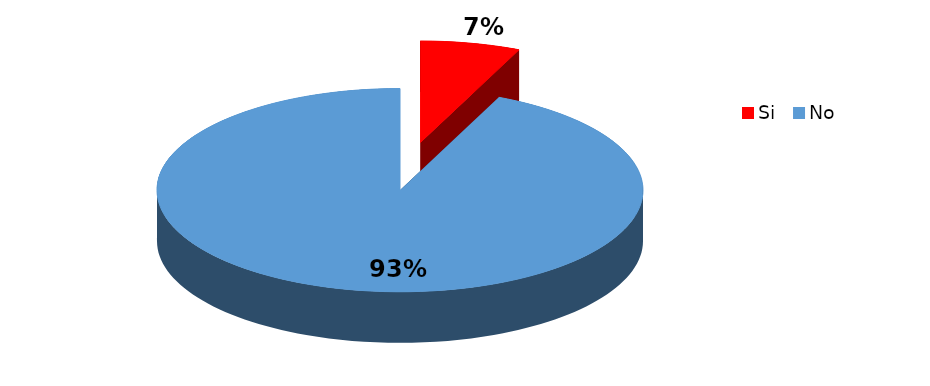
| Category | Series 0 |
|---|---|
| Si | 1 |
| No | 14 |